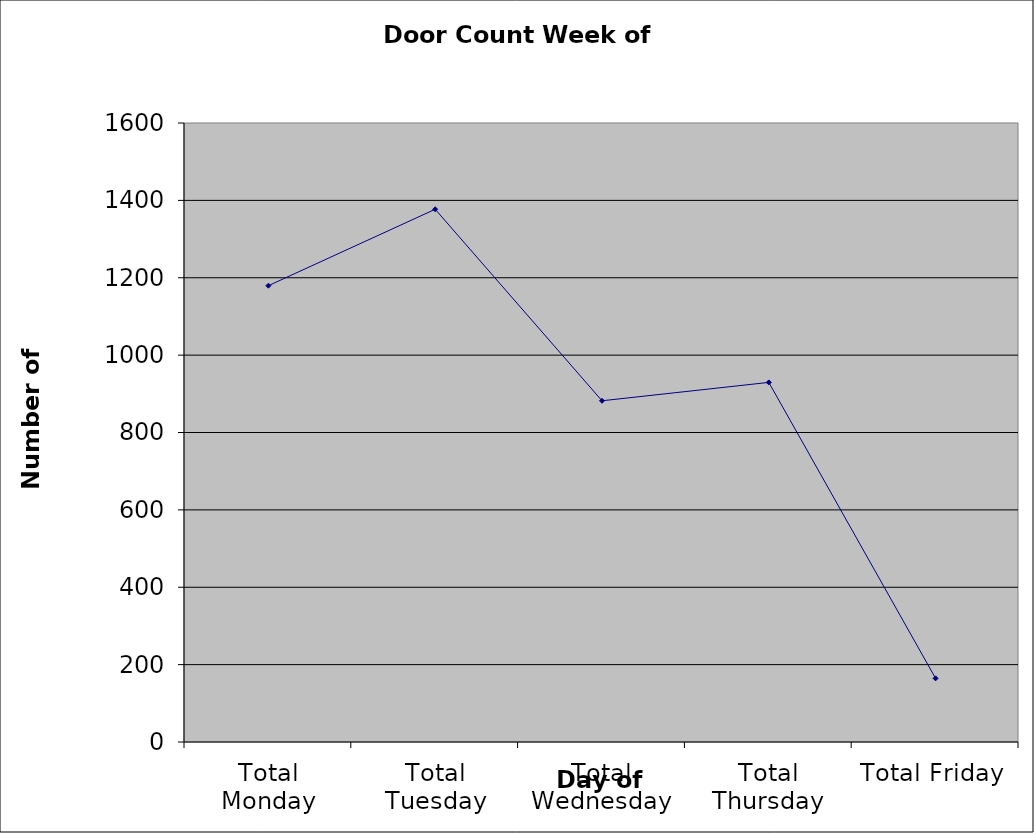
| Category | Series 0 |
|---|---|
| Total Monday | 1179.5 |
| Total Tuesday | 1377 |
| Total Wednesday | 882 |
| Total Thursday | 929.5 |
| Total Friday | 164.5 |